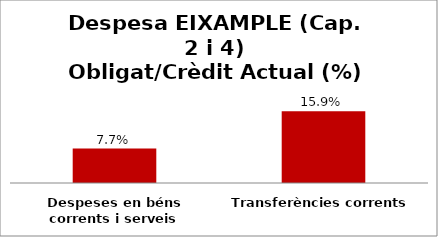
| Category | Series 0 |
|---|---|
| Despeses en béns corrents i serveis | 0.077 |
| Transferències corrents | 0.159 |